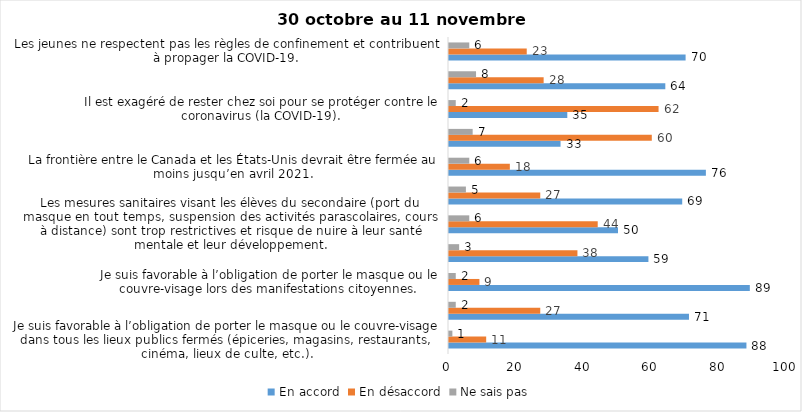
| Category | En accord | En désaccord | Ne sais pas |
|---|---|---|---|
| Je suis favorable à l’obligation de porter le masque ou le couvre-visage dans tous les lieux publics fermés (épiceries, magasins, restaurants, cinéma, lieux de culte, etc.). | 88 | 11 | 1 |
| C’est une bonne chose que les policiers puissent donner facilement des contraventions aux gens qui ne respectent pas les mesures pour prévenir le coronavirus (la COVID-19). | 71 | 27 | 2 |
| Je suis favorable à l’obligation de porter le masque ou le couvre-visage lors des manifestations citoyennes. | 89 | 9 | 2 |
| C’est une bonne chose d’arrêter les activités sportives de groupe (ex. hockey, soccer, yoga, etc.) et de fermer les centres d’entraînement (gyms) dans les zones rouges. | 59 | 38 | 3 |
| Les mesures sanitaires visant les élèves du secondaire (port du masque en tout temps, suspension des activités parascolaires, cours à distance) sont trop restrictives et risque de nuire à leur santé mentale et leur développement. | 50 | 44 | 6 |
| Je suis favorable à l’obligation de porter le masque ou le couvre-visage en tout temps pour les élèves au secondaire. | 69 | 27 | 5 |
| La frontière entre le Canada et les États-Unis devrait être fermée au moins jusqu’en avril 2021. | 76 | 18 | 6 |
| Le gouvernement et les médias exagèrent par rapport au coronavirus (la COVID-19). | 33 | 60 | 7 |
| Il est exagéré de rester chez soi pour se protéger contre le coronavirus (la COVID-19). | 35 | 62 | 2 |
| J’ai peur que le système de santé soit débordé par les cas de COVID-19 suite au «déconfinement». | 64 | 28 | 8 |
| Les jeunes ne respectent pas les règles de confinement et contribuent à propager la COVID-19. | 70 | 23 | 6 |